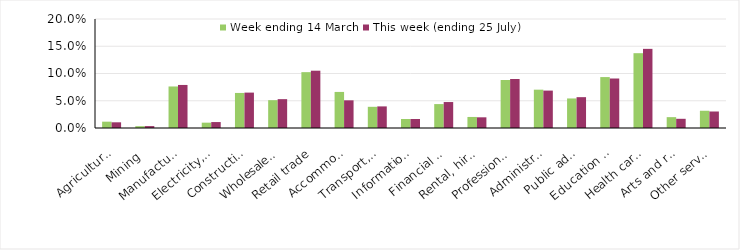
| Category | Week ending 14 March | This week (ending 25 July) |
|---|---|---|
| Agriculture, forestry and fishing | 0.012 | 0.01 |
| Mining | 0.003 | 0.004 |
| Manufacturing | 0.076 | 0.079 |
| Electricity, gas, water and waste services | 0.01 | 0.011 |
| Construction | 0.064 | 0.065 |
| Wholesale trade | 0.051 | 0.053 |
| Retail trade | 0.102 | 0.105 |
| Accommodation and food services | 0.066 | 0.051 |
| Transport, postal and warehousing | 0.039 | 0.04 |
| Information media and telecommunications | 0.017 | 0.017 |
| Financial and insurance services | 0.044 | 0.048 |
| Rental, hiring and real estate services | 0.02 | 0.02 |
| Professional, scientific and technical services | 0.088 | 0.09 |
| Administrative and support services | 0.07 | 0.069 |
| Public administration and safety | 0.054 | 0.057 |
| Education and training | 0.093 | 0.091 |
| Health care and social assistance | 0.137 | 0.145 |
| Arts and recreation services | 0.02 | 0.017 |
| Other services | 0.032 | 0.03 |